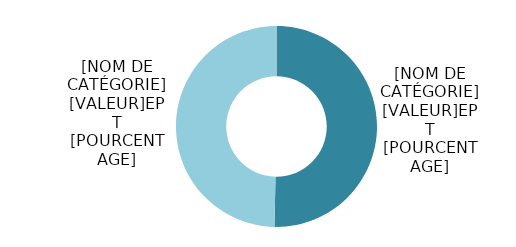
| Category | Series 0 |
|---|---|
| Hommes | 2388.788 |
| Femmes | 2358.302 |